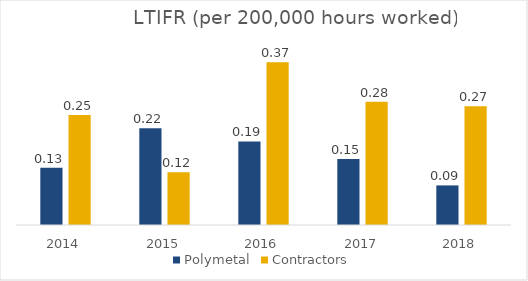
| Category | Polymetal | Contractors |
|---|---|---|
| 2014.0 | 0.13 | 0.25 |
| 2015.0 | 0.22 | 0.12 |
| 2016.0 | 0.19 | 0.37 |
| 2017.0 | 0.15 | 0.28 |
| 2018.0 | 0.09 | 0.27 |